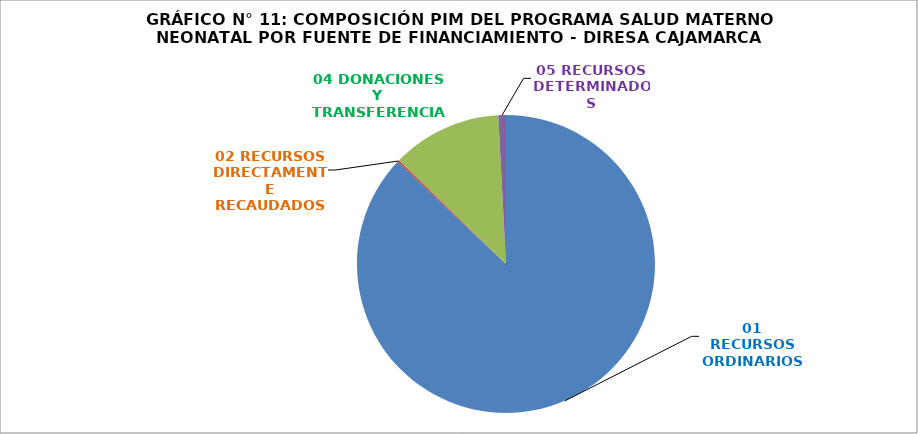
| Category | 445 REGION CAJAMARCA |
|---|---|
| 01 RECURSOS ORDINARIOS | 0.87 |
| 02 RECURSOS DIRECTAMENTE RECAUDADOS | 0.002 |
| 04 DONACIONES Y TRANSFERENCIAS | 0.119 |
| 05 RECURSOS DETERMINADOS | 0.008 |